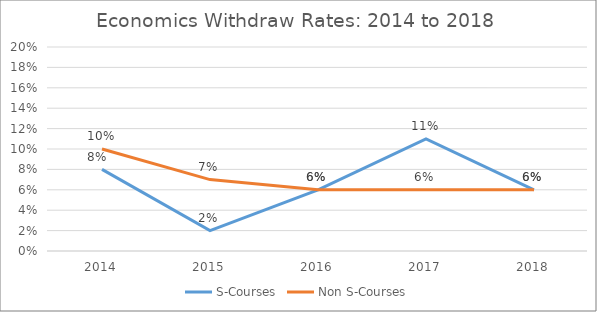
| Category | S-Courses | Non S-Courses |
|---|---|---|
| 2014.0 | 0.08 | 0.1 |
| 2015.0 | 0.02 | 0.07 |
| 2016.0 | 0.06 | 0.06 |
| 2017.0 | 0.11 | 0.06 |
| 2018.0 | 0.06 | 0.06 |